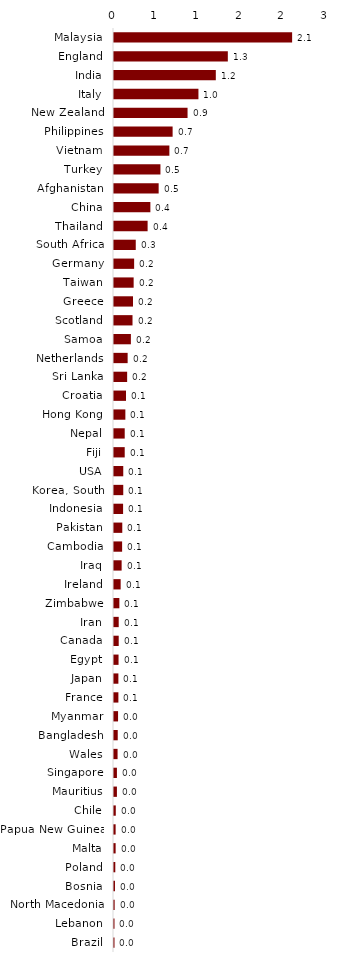
| Category | Series 0 |
|---|---|
| Malaysia | 2.101 |
| England | 1.342 |
| India | 1.201 |
| Italy | 0.996 |
| New Zealand | 0.867 |
| Philippines | 0.691 |
| Vietnam | 0.653 |
| Turkey | 0.548 |
| Afghanistan | 0.527 |
| China | 0.429 |
| Thailand | 0.396 |
| South Africa | 0.257 |
| Germany | 0.237 |
| Taiwan | 0.232 |
| Greece | 0.224 |
| Scotland | 0.218 |
| Samoa | 0.199 |
| Netherlands | 0.161 |
| Sri Lanka | 0.155 |
| Croatia | 0.142 |
| Hong Kong | 0.134 |
| Nepal | 0.126 |
| Fiji | 0.126 |
| USA | 0.109 |
| Korea, South | 0.109 |
| Indonesia | 0.107 |
| Pakistan | 0.098 |
| Cambodia | 0.096 |
| Iraq | 0.09 |
| Ireland | 0.079 |
| Zimbabwe | 0.063 |
| Iran | 0.056 |
| Canada | 0.056 |
| Egypt | 0.054 |
| Japan | 0.052 |
| France | 0.052 |
| Myanmar | 0.048 |
| Bangladesh | 0.044 |
| Wales | 0.042 |
| Singapore | 0.034 |
| Mauritius | 0.034 |
| Chile | 0.021 |
| Papua New Guinea | 0.019 |
| Malta | 0.019 |
| Poland | 0.015 |
| Bosnia | 0.011 |
| North Macedonia | 0.008 |
| Lebanon | 0.006 |
| Brazil | 0.006 |